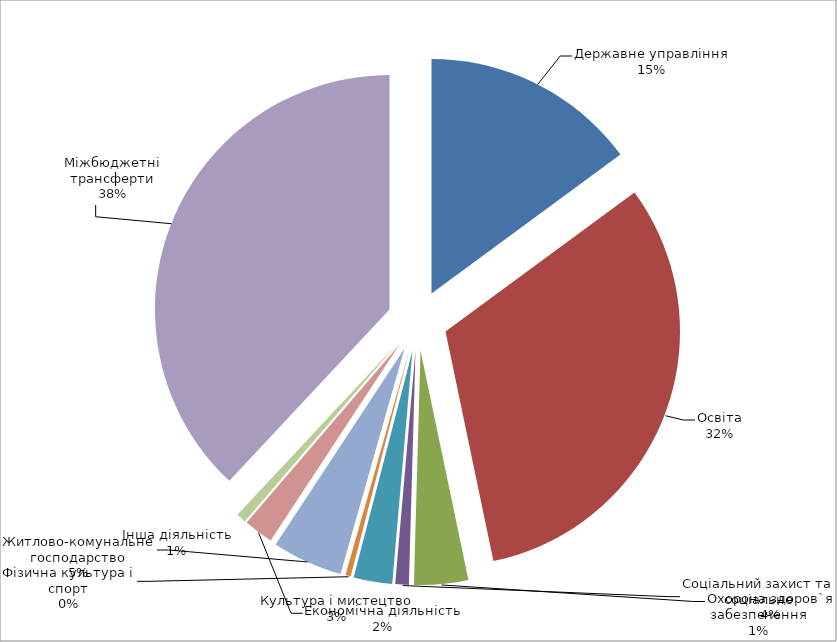
| Category | Series 0 |
|---|---|
| Державне управління | 18921559.86 |
| Освіта | 40372728.72 |
| Охорона здоров`я | 4728332.21 |
| Соціальний захист та соціальне забезпечення | 1182906.31 |
| Культура i мистецтво | 3369239.76 |
| Фiзична культура i спорт | 462788.1 |
| Житлово-комунальне господарство | 6162317.83 |
| Економічна діяльність | 2586575.93 |
| Інша діяльність | 845650.21 |
| Міжбюджетні трансферти | 48273097 |